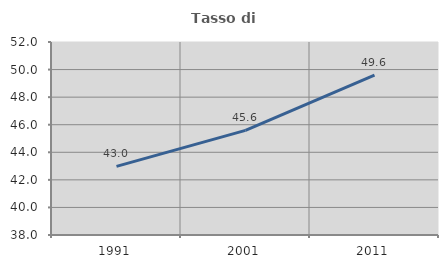
| Category | Tasso di occupazione   |
|---|---|
| 1991.0 | 42.979 |
| 2001.0 | 45.591 |
| 2011.0 | 49.597 |